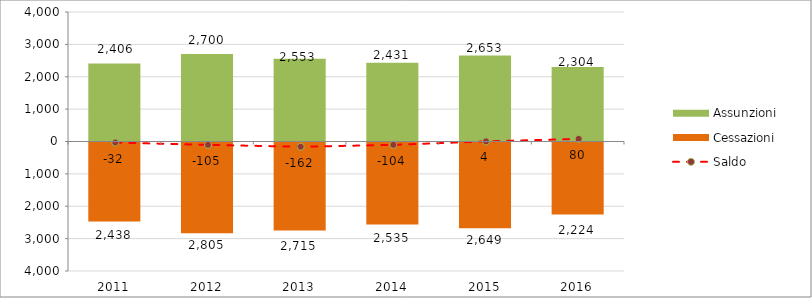
| Category | Assunzioni | Cessazioni |
|---|---|---|
| 2011.0 | 2406 | -2438 |
| 2012.0 | 2700 | -2805 |
| 2013.0 | 2553 | -2715 |
| 2014.0 | 2431 | -2535 |
| 2015.0 | 2653 | -2649 |
| 2016.0 | 2304 | -2224 |